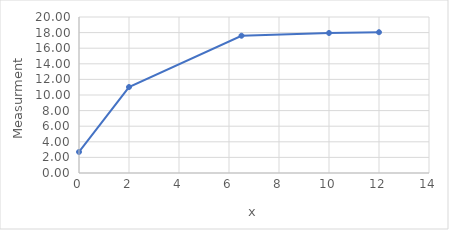
| Category | Series 0 |
|---|---|
| 0.0 | 2.7 |
| 2.0 | 11.02 |
| 6.5 | 17.6 |
| 10.0 | 17.95 |
| 12.0 | 18.05 |